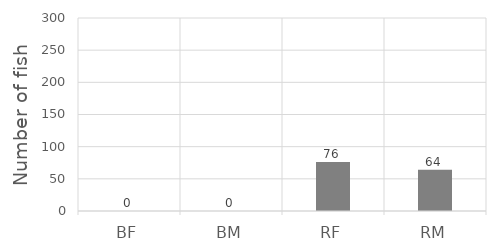
| Category | Series 0 |
|---|---|
| BF | 0 |
| BM | 0 |
| RF | 76 |
| RM | 64 |